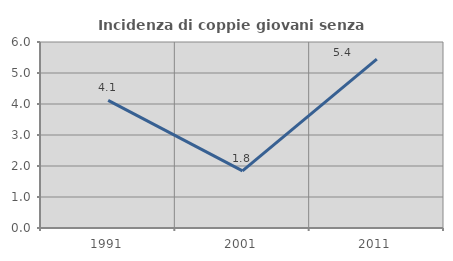
| Category | Incidenza di coppie giovani senza figli |
|---|---|
| 1991.0 | 4.118 |
| 2001.0 | 1.84 |
| 2011.0 | 5.446 |